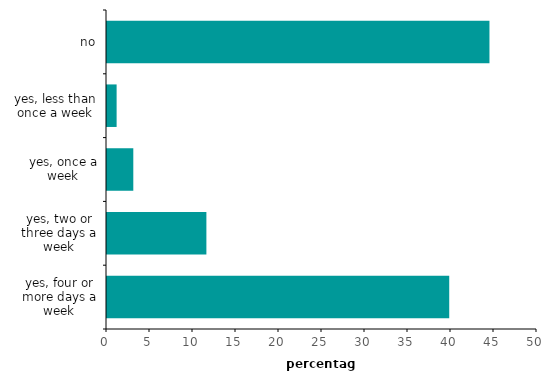
| Category | Series 0 |
|---|---|
| yes, four or more days a week | 39.794 |
| yes, two or three days a week | 11.557 |
| yes, once a week | 3.058 |
| yes, less than once a week | 1.119 |
| no | 44.472 |